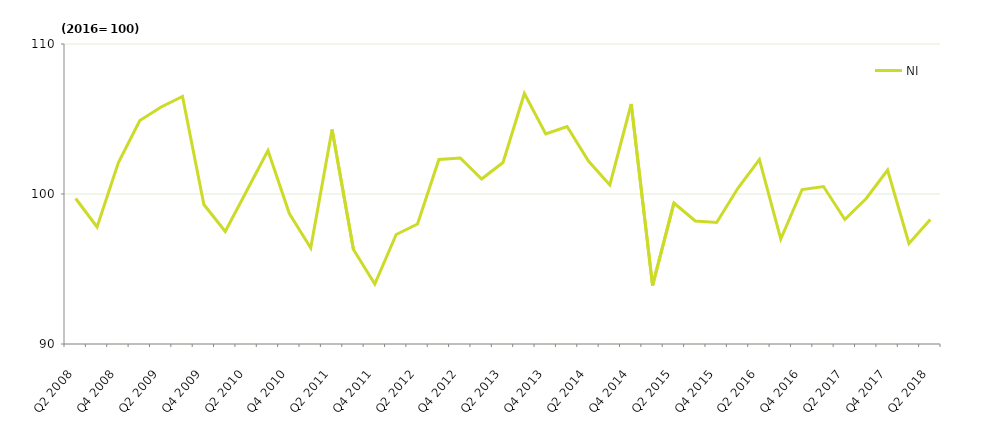
| Category | NI |
|---|---|
| Q2 2008 | 99.7 |
| Q3 2008 | 97.8 |
| Q4 2008 | 102.1 |
| Q1 2009 | 104.9 |
| Q2 2009 | 105.8 |
| Q3 2009 | 106.5 |
| Q4 2009 | 99.3 |
| Q1 2010 | 97.5 |
| Q2 2010 | 100.2 |
| Q3 2010 | 102.9 |
| Q4 2010 | 98.7 |
| Q1 2011 | 96.4 |
| Q2 2011 | 104.3 |
| Q3 2011 | 96.3 |
| Q4 2011 | 94 |
| Q1 2012 | 97.3 |
| Q2 2012 | 98 |
| Q3 2012 | 102.3 |
| Q4 2012 | 102.4 |
| Q1 2013 | 101 |
| Q2 2013 | 102.1 |
| Q3 2013 | 106.7 |
| Q4 2013 | 104 |
| Q1 2014 | 104.5 |
| Q2 2014 | 102.2 |
| Q3 2014 | 100.6 |
| Q4 2014 | 106 |
| Q1 2015 | 93.9 |
| Q2 2015 | 99.4 |
| Q3 2015 | 98.2 |
| Q4 2015 | 98.1 |
| Q1 2016 | 100.4 |
| Q2 2016 | 102.3 |
| Q3 2016 | 97 |
| Q4 2016 | 100.3 |
| Q1 2017 | 100.5 |
| Q2 2017 | 98.3 |
| Q3 2017 | 99.7 |
| Q4 2017 | 101.6 |
| Q1 2018 | 96.7 |
| Q2 2018 | 98.3 |